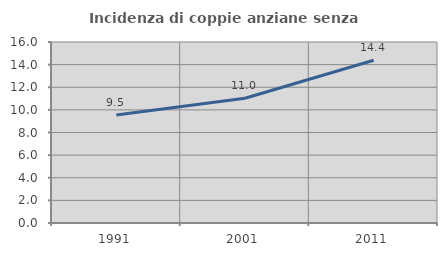
| Category | Incidenza di coppie anziane senza figli  |
|---|---|
| 1991.0 | 9.545 |
| 2001.0 | 11.033 |
| 2011.0 | 14.39 |